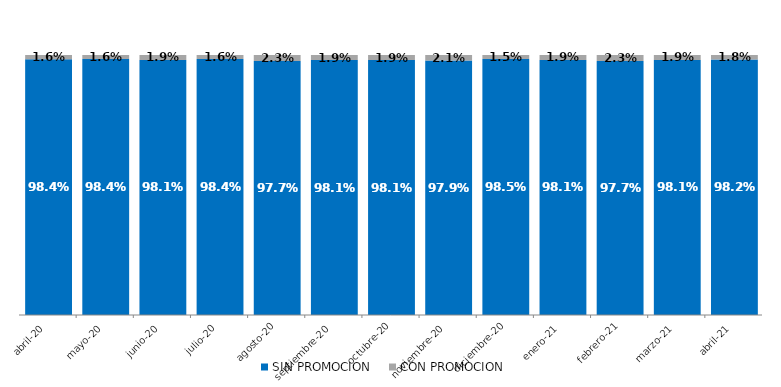
| Category | SIN PROMOCION   | CON PROMOCION   |
|---|---|---|
| 2020-04-01 | 0.984 | 0.016 |
| 2020-05-01 | 0.984 | 0.016 |
| 2020-06-01 | 0.981 | 0.019 |
| 2020-07-01 | 0.984 | 0.016 |
| 2020-08-01 | 0.977 | 0.023 |
| 2020-09-01 | 0.981 | 0.019 |
| 2020-10-01 | 0.981 | 0.019 |
| 2020-11-01 | 0.979 | 0.021 |
| 2020-12-01 | 0.985 | 0.015 |
| 2021-01-01 | 0.981 | 0.019 |
| 2021-02-01 | 0.977 | 0.023 |
| 2021-03-01 | 0.981 | 0.019 |
| 2021-04-01 | 0.982 | 0.018 |